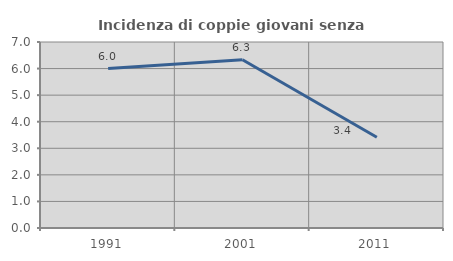
| Category | Incidenza di coppie giovani senza figli |
|---|---|
| 1991.0 | 6.002 |
| 2001.0 | 6.33 |
| 2011.0 | 3.417 |